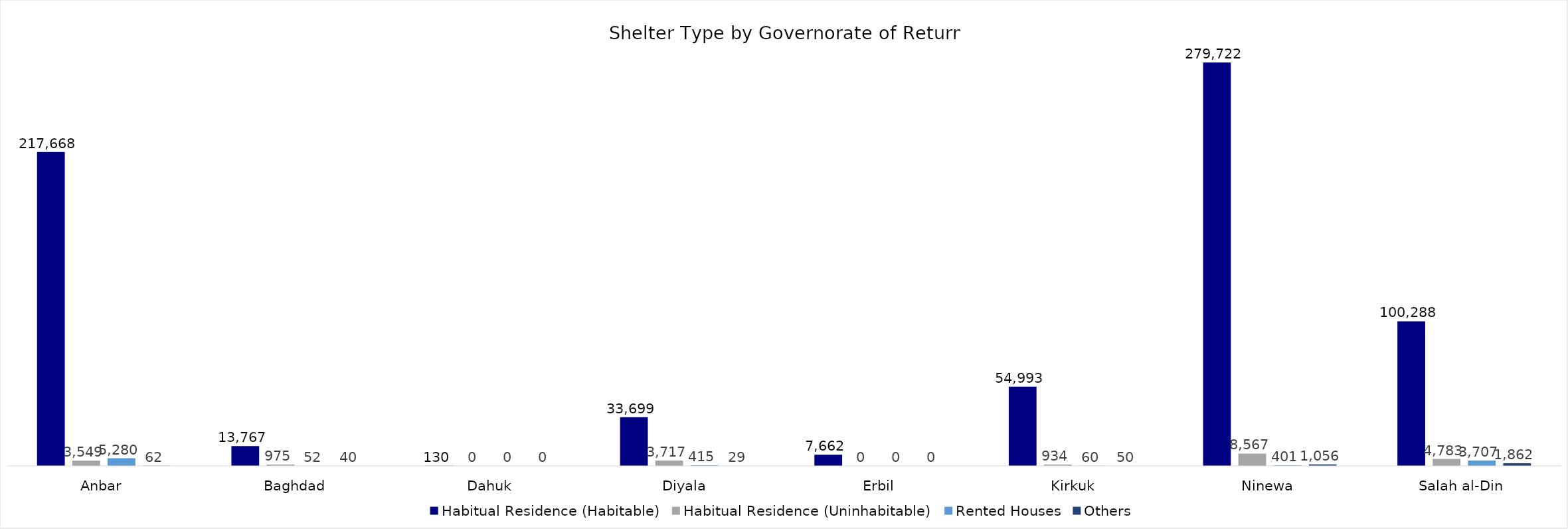
| Category | Habitual Residence (Habitable) | Habitual Residence (Uninhabitable) | Rented Houses | Others |
|---|---|---|---|---|
| Anbar | 217668 | 3549 | 5280 | 62 |
| Baghdad | 13767 | 975 | 52 | 40 |
| Dahuk | 130 | 0 | 0 | 0 |
| Diyala | 33699 | 3717 | 415 | 29 |
| Erbil | 7662 | 0 | 0 | 0 |
| Kirkuk | 54993 | 934 | 60 | 50 |
| Ninewa | 279722 | 8567 | 401 | 1056 |
| Salah al-Din | 100288 | 4783 | 3707 | 1862 |